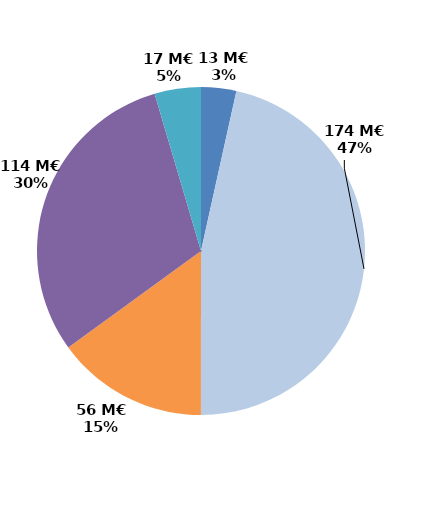
| Category | Series 0 |
|---|---|
| Contrats aidés marchand (hors IAE) | 12.992 |
| Contrats aidés non marchand (hors IAE) | 174.35 |
| Insertion par l'activité économique | 56.173 |
| Mesures en faveur des handicapés | 114.005 |
| Autres emplois aidés | 17.109 |